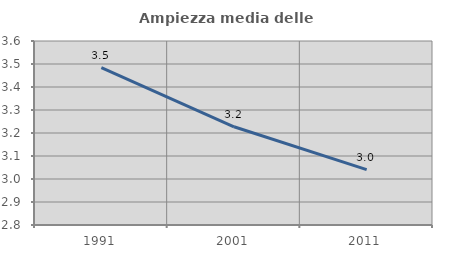
| Category | Ampiezza media delle famiglie |
|---|---|
| 1991.0 | 3.484 |
| 2001.0 | 3.227 |
| 2011.0 | 3.041 |